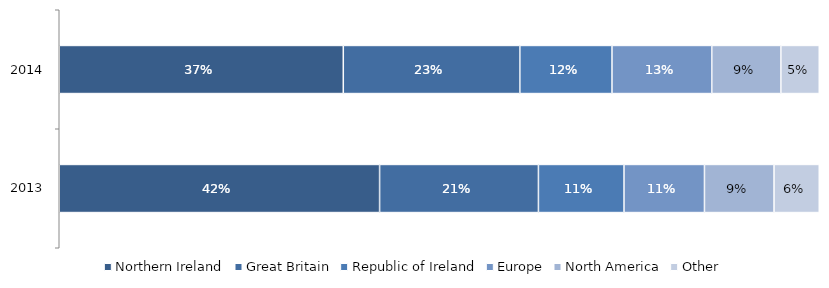
| Category | Northern Ireland | Great Britain | Republic of Ireland | Europe | North America | Other |
|---|---|---|---|---|---|---|
| 2013.0 | 0.422 | 0.209 | 0.113 | 0.106 | 0.092 | 0.06 |
| 2014.0 | 0.37 | 0.23 | 0.12 | 0.13 | 0.09 | 0.05 |